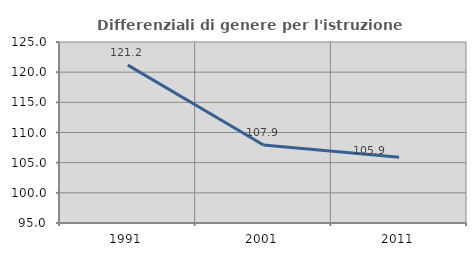
| Category | Differenziali di genere per l'istruzione superiore |
|---|---|
| 1991.0 | 121.164 |
| 2001.0 | 107.926 |
| 2011.0 | 105.906 |